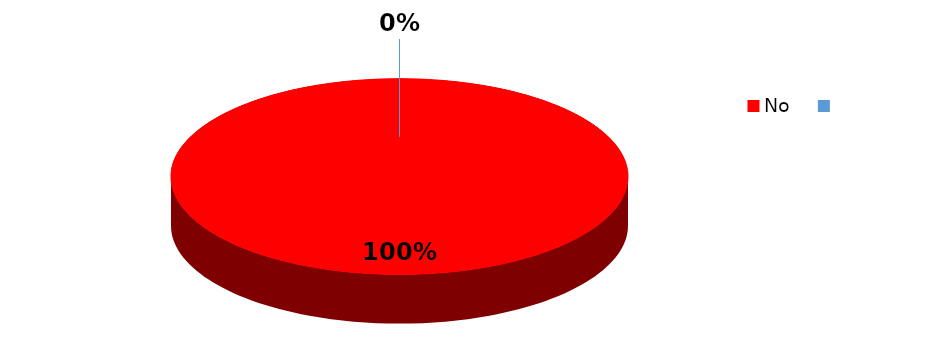
| Category | Frecuencia |
|---|---|
| No | 15 |